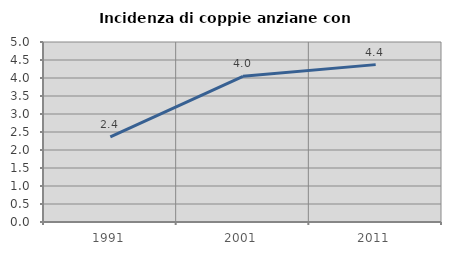
| Category | Incidenza di coppie anziane con figli |
|---|---|
| 1991.0 | 2.367 |
| 2001.0 | 4.046 |
| 2011.0 | 4.372 |